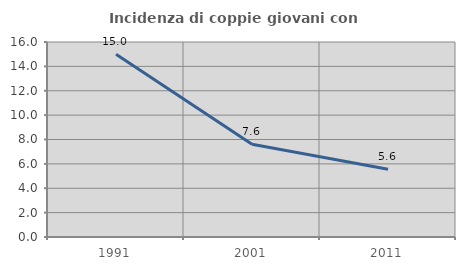
| Category | Incidenza di coppie giovani con figli |
|---|---|
| 1991.0 | 15 |
| 2001.0 | 7.603 |
| 2011.0 | 5.564 |